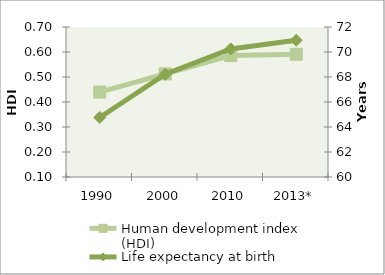
| Category | Human development index (HDI) |
|---|---|
| 1990 | 0.44 |
| 2000 | 0.512 |
| 2010 | 0.586 |
| 2013* | 0.591 |